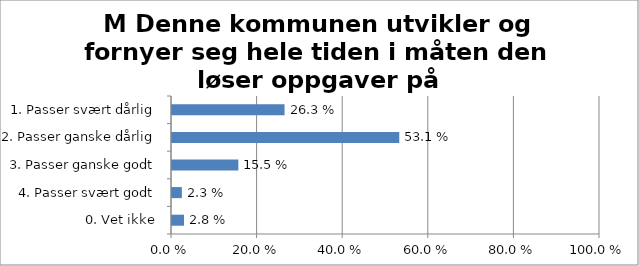
| Category | M Denne kommunen utvikler og fornyer seg hele tiden i måten den løser oppgaver på |
|---|---|
| 1. Passer svært dårlig | 0.263 |
| 2. Passer ganske dårlig | 0.531 |
| 3. Passer ganske godt | 0.155 |
| 4. Passer svært godt | 0.023 |
| 0. Vet ikke | 0.028 |